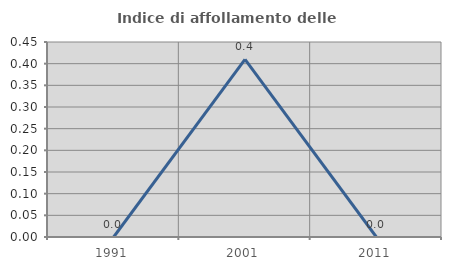
| Category | Indice di affollamento delle abitazioni  |
|---|---|
| 1991.0 | 0 |
| 2001.0 | 0.41 |
| 2011.0 | 0 |